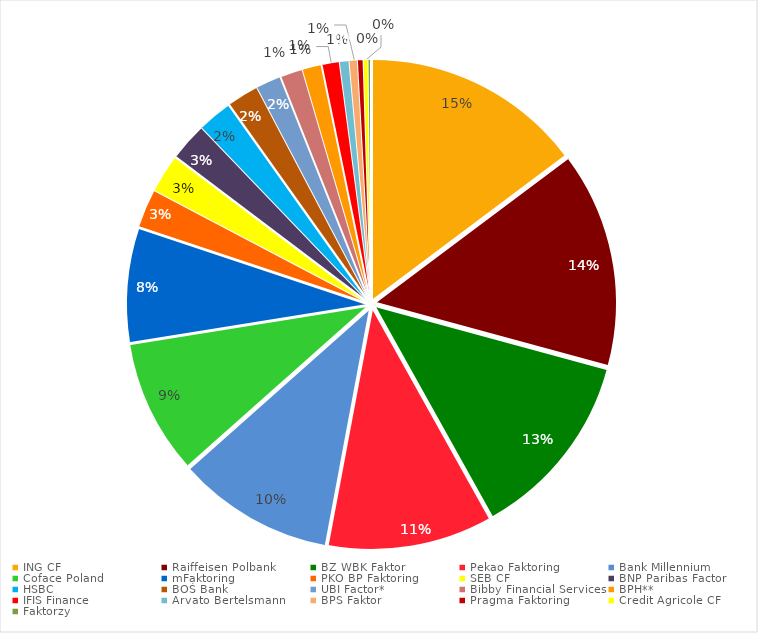
| Category | Series 0 |
|---|---|
| ING CF | 12123.98 |
| Raiffeisen Polbank | 11860.69 |
| BZ WBK Faktor | 10399.49 |
| Pekao Faktoring | 9061.04 |
| Bank Millennium | 8610.58 |
| Coface Poland | 7403.19 |
| mFaktoring | 6276.7 |
| PKO BP Faktoring | 2127.9 |
| SEB CF | 2124.05 |
| BNP Paribas Factor | 2086.97 |
| HSBC | 1911 |
| BOŚ Bank | 1745.35 |
| UBI Factor* | 1385.07 |
| Bibby Financial Services | 1222.68 |
| BPH** | 1059.35 |
| IFIS Finance | 949.61 |
| Arvato Bertelsmann | 530.21 |
| BPS Faktor | 459.57 |
| Pragma Faktoring | 311.7 |
| Credit Agricole CF | 267.2 |
| Faktorzy | 136.13 |